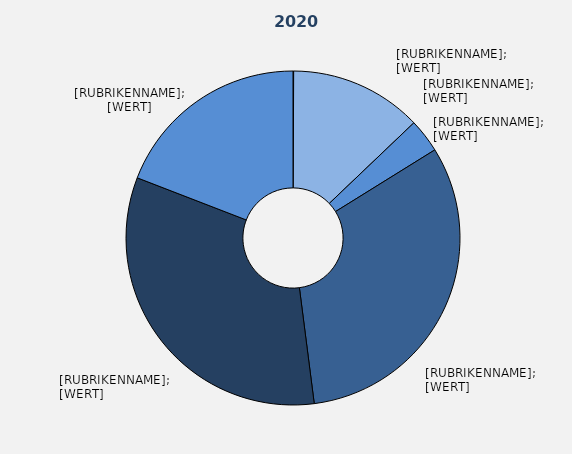
| Category | Series 1 |
|---|---|
| Land- und Forstwirtschaft, Fischerei | 0.064 |
| Produzierendes Gewerbe ohne Baugewerbe | 12.82 |
| Baugewerbe | 3.267 |
| Handel, Verkehr, Gastgewerbe, 
Information und Kommunikation | 31.818 |
| Finanz-, Versicherungs- und 
Unternehmensdienstleister, 
Grundstücks- und Wohnungswesen | 32.899 |
| Öffentliche und sonstige 
Dienstleister, Erziehung, 
Unterricht | 19.132 |